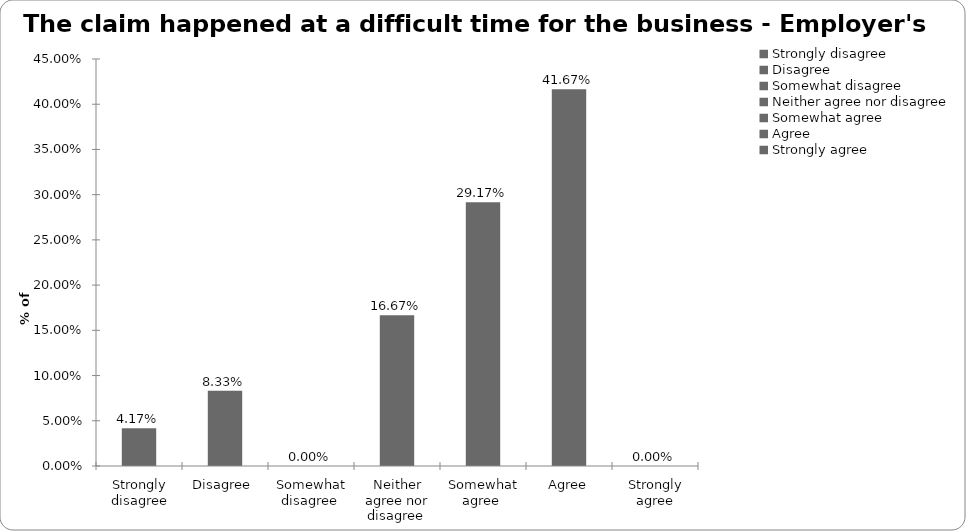
| Category | Employer's liability |
|---|---|
| Strongly disagree | 0.042 |
| Disagree  | 0.083 |
| Somewhat disagree  | 0 |
| Neither agree nor disagree  | 0.167 |
| Somewhat agree  | 0.292 |
| Agree | 0.417 |
| Strongly agree | 0 |